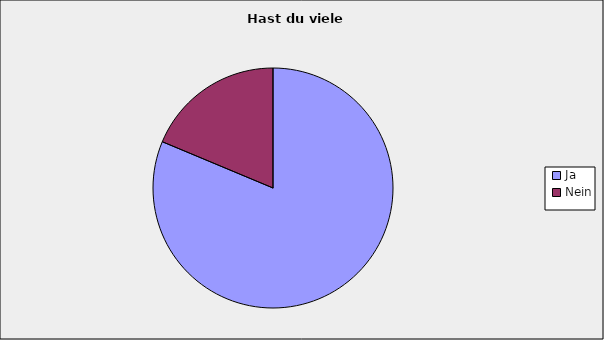
| Category | Series 0 |
|---|---|
| Ja | 0.813 |
| Nein | 0.187 |